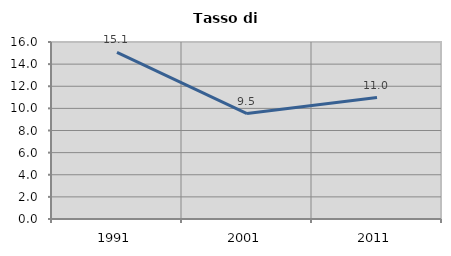
| Category | Tasso di disoccupazione   |
|---|---|
| 1991.0 | 15.062 |
| 2001.0 | 9.528 |
| 2011.0 | 10.975 |